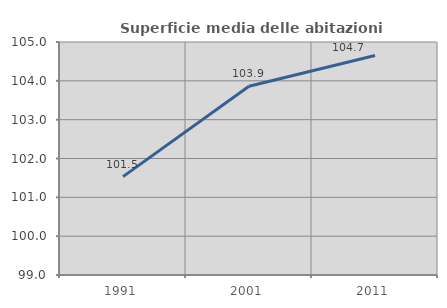
| Category | Superficie media delle abitazioni occupate |
|---|---|
| 1991.0 | 101.534 |
| 2001.0 | 103.86 |
| 2011.0 | 104.653 |